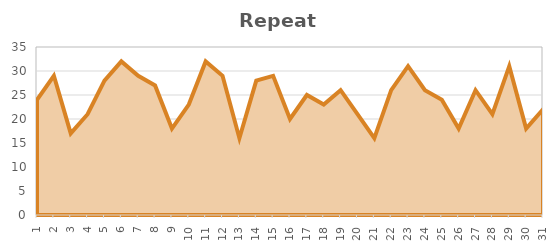
| Category | Number |
|---|---|
| 1.0 | 24 |
| 2.0 | 29 |
| 3.0 | 17 |
| 4.0 | 21 |
| 5.0 | 28 |
| 6.0 | 32 |
| 7.0 | 29 |
| 8.0 | 27 |
| 9.0 | 18 |
| 10.0 | 23 |
| 11.0 | 32 |
| 12.0 | 29 |
| 13.0 | 16 |
| 14.0 | 28 |
| 15.0 | 29 |
| 16.0 | 20 |
| 17.0 | 25 |
| 18.0 | 23 |
| 19.0 | 26 |
| 20.0 | 21 |
| 21.0 | 16 |
| 22.0 | 26 |
| 23.0 | 31 |
| 24.0 | 26 |
| 25.0 | 24 |
| 26.0 | 18 |
| 27.0 | 26 |
| 28.0 | 21 |
| 29.0 | 31 |
| 30.0 | 18 |
| 31.0 | 22 |